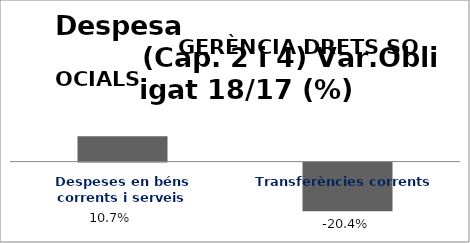
| Category | Series 0 |
|---|---|
| Despeses en béns corrents i serveis | 0.107 |
| Transferències corrents | -0.204 |